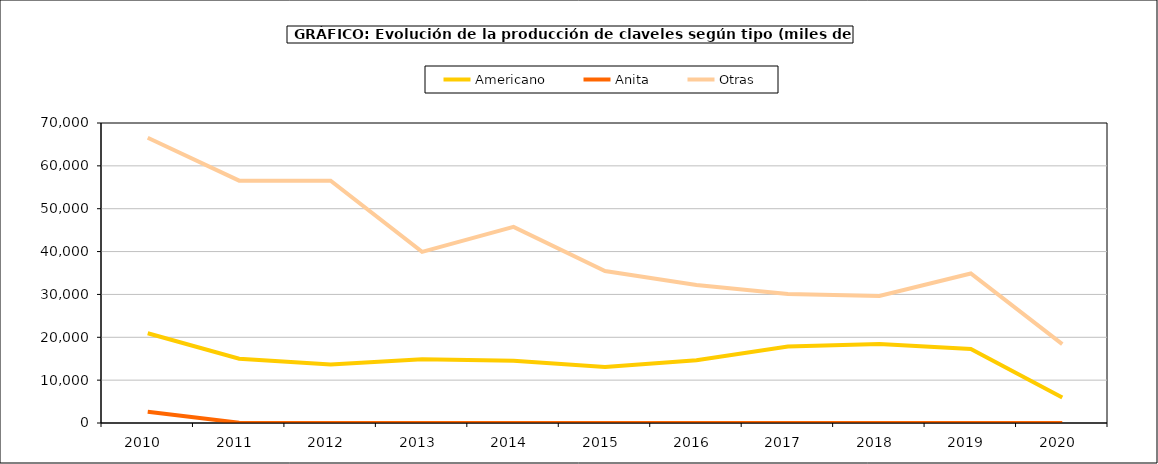
| Category | Americano | Anita | Otras |
|---|---|---|---|
| 2010.0 | 20931 | 2642 | 66553 |
| 2011.0 | 15002 | 54 | 56550 |
| 2012.0 | 13658 | 0 | 56550 |
| 2013.0 | 14880 | 0 | 39920 |
| 2014.0 | 14528 | 0 | 45749 |
| 2015.0 | 13065 | 0 | 35460 |
| 2016.0 | 14654 | 0 | 32202 |
| 2017.0 | 17866 | 0 | 30124 |
| 2018.0 | 18413 | 0 | 29630 |
| 2019.0 | 17283 | 3 | 34898 |
| 2020.0 | 5959 | 7 | 18397 |